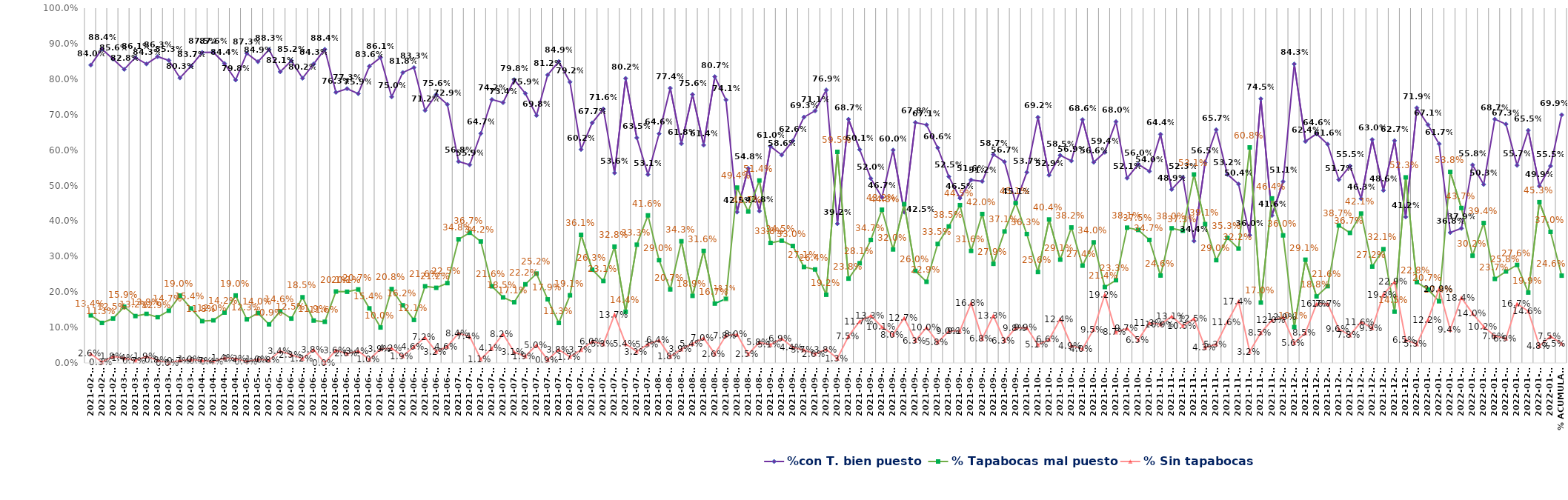
| Category | %con T. bien puesto | % Tapabocas mal puesto | % Sin tapabocas |
|---|---|---|---|
| 2021-02-19 | 0.84 | 0.134 | 0.026 |
| 2021-02-23 | 0.884 | 0.113 | 0.003 |
| 2021-02-25 | 0.856 | 0.125 | 0.018 |
| 2021-03-04 | 0.828 | 0.159 | 0.014 |
| 2021-03-05 | 0.861 | 0.132 | 0.007 |
| 2021-03-10 | 0.843 | 0.138 | 0.019 |
| 2021-03-11 | 0.863 | 0.129 | 0.008 |
| 2021-03-12 | 0.853 | 0.147 | 0 |
| 2021-03-29 | 0.803 | 0.19 | 0.007 |
| 2021-03-30 | 0.837 | 0.154 | 0.01 |
| 2021-04-06 | 0.875 | 0.118 | 0.007 |
| 2021-04-07 | 0.876 | 0.12 | 0.004 |
| 2021-04-15 | 0.844 | 0.142 | 0.014 |
| 2021-04-20 | 0.798 | 0.19 | 0.012 |
| 2021-05-04 | 0.873 | 0.123 | 0.004 |
| 2021-05-07 | 0.849 | 0.14 | 0.01 |
| 2021-05-21 | 0.883 | 0.109 | 0.008 |
| 2021-06-01 | 0.821 | 0.146 | 0.034 |
| 2021-06-04 | 0.852 | 0.125 | 0.023 |
| 2021-06-08 | 0.802 | 0.185 | 0.012 |
| 2021-06-10 | 0.843 | 0.119 | 0.038 |
| 2021-06-11 | 0.884 | 0.116 | 0 |
| 2021-06-12 | 0.763 | 0.201 | 0.036 |
| 2021-06-15 | 0.773 | 0.201 | 0.026 |
| 2021-06-16 | 0.759 | 0.207 | 0.034 |
| 2021-06-18 | 0.836 | 0.154 | 0.01 |
| 2021-06-19 | 0.861 | 0.1 | 0.039 |
| 2021-06-21 | 0.75 | 0.208 | 0.042 |
| 2021-06-22 | 0.818 | 0.162 | 0.019 |
| 2021-06-23 | 0.833 | 0.121 | 0.046 |
| 2021-06-25 | 0.712 | 0.216 | 0.072 |
| 2021-06-26 | 0.756 | 0.212 | 0.032 |
| 2021-06-30 | 0.729 | 0.225 | 0.046 |
| 2021-07-03 | 0.568 | 0.348 | 0.084 |
| 2021-07-06 | 0.559 | 0.367 | 0.074 |
| 2021-07-07 | 0.647 | 0.342 | 0.011 |
| 2021-07-08 | 0.742 | 0.216 | 0.041 |
| 2021-07-09 | 0.734 | 0.185 | 0.082 |
| 2021-07-10 | 0.798 | 0.171 | 0.031 |
| 2021-07-12 | 0.759 | 0.222 | 0.019 |
| 2021-07-13 | 0.698 | 0.252 | 0.05 |
| 2021-07-14 | 0.812 | 0.179 | 0.009 |
| 2021-07-15 | 0.849 | 0.113 | 0.038 |
| 2021-07-16 | 0.792 | 0.191 | 0.017 |
| 2021-07-24 | 0.602 | 0.361 | 0.037 |
| 2021-07-19 | 0.677 | 0.263 | 0.06 |
| 2021-07-21 | 0.716 | 0.231 | 0.053 |
| 2021-07-28 | 0.536 | 0.328 | 0.137 |
| 2021-07-29 | 0.802 | 0.144 | 0.054 |
| 2021-07-30 | 0.635 | 0.333 | 0.032 |
| 2021-07-31 | 0.531 | 0.416 | 0.053 |
| 2021-08-03 | 0.646 | 0.29 | 0.064 |
| 2021-08-04 | 0.774 | 0.207 | 0.018 |
| 2021-08-05 | 0.618 | 0.343 | 0.039 |
| 2021-08-06 | 0.756 | 0.189 | 0.054 |
| 2021-08-17 | 0.614 | 0.316 | 0.07 |
| 2021-08-18 | 0.807 | 0.167 | 0.026 |
| 2021-08-19 | 0.741 | 0.181 | 0.078 |
| 2021-08-20 | 0.425 | 0.494 | 0.08 |
| 2021-08-30 | 0.548 | 0.427 | 0.025 |
| 2021-08-31 | 0.428 | 0.514 | 0.058 |
| 2021-09-01 | 0.61 | 0.338 | 0.051 |
| 2021-09-02 | 0.586 | 0.345 | 0.069 |
| 2021-09-03 | 0.626 | 0.33 | 0.044 |
| 2021-09-04 | 0.693 | 0.271 | 0.037 |
| 2021-09-06 | 0.711 | 0.264 | 0.026 |
| 2021-09-08 | 0.769 | 0.192 | 0.038 |
| 2021-09-10 | 0.392 | 0.595 | 0.013 |
| 2021-09-13 | 0.687 | 0.238 | 0.075 |
| 2021-09-14 | 0.601 | 0.281 | 0.117 |
| 2021-09-15 | 0.52 | 0.347 | 0.133 |
| 2021-09-16 | 0.467 | 0.432 | 0.101 |
| 2021-09-17 | 0.6 | 0.32 | 0.08 |
| 2021-09-18 | 0.425 | 0.448 | 0.127 |
| 2021-09-20 | 0.678 | 0.26 | 0.063 |
| 2021-09-21 | 0.671 | 0.229 | 0.1 |
| 2021-09-22 | 0.606 | 0.335 | 0.058 |
| 2021-09-23 | 0.525 | 0.385 | 0.09 |
| 2021-09-24 | 0.465 | 0.445 | 0.091 |
| 2021-09-25 | 0.516 | 0.316 | 0.168 |
| 2021-09-27 | 0.512 | 0.42 | 0.068 |
| 2021-09-28 | 0.587 | 0.279 | 0.133 |
| 2021-09-29 | 0.567 | 0.371 | 0.062 |
| 2021-09-30 | 0.451 | 0.451 | 0.098 |
| 2021-10-01 | 0.537 | 0.363 | 0.099 |
| 2021-10-05 | 0.692 | 0.256 | 0.051 |
| 2021-10-11 | 0.529 | 0.404 | 0.066 |
| 2021-10-13 | 0.585 | 0.291 | 0.124 |
| 2021-10-14 | 0.569 | 0.382 | 0.049 |
| 2021-10-15 | 0.686 | 0.274 | 0.04 |
| 2021-10-16 | 0.566 | 0.34 | 0.095 |
| 2021-10-19 | 0.594 | 0.214 | 0.192 |
| 2021-10-20 | 0.68 | 0.233 | 0.087 |
| 2021-10-22 | 0.521 | 0.381 | 0.097 |
| 2021-10-26 | 0.56 | 0.375 | 0.065 |
| 2021-10-27 | 0.54 | 0.347 | 0.113 |
| 2021-11-02 | 0.644 | 0.246 | 0.109 |
| 2021-11-03 | 0.489 | 0.38 | 0.131 |
| 2021-11-06 | 0.523 | 0.373 | 0.105 |
| 2021-11-09 | 0.344 | 0.531 | 0.125 |
| 2021-11-10 | 0.565 | 0.391 | 0.043 |
| 2021-11-17 | 0.657 | 0.29 | 0.053 |
| 2021-11-22 | 0.532 | 0.353 | 0.116 |
| 2021-11-24 | 0.504 | 0.322 | 0.174 |
| 2021-11-25 | 0.36 | 0.608 | 0.032 |
| 2021-11-26 | 0.745 | 0.17 | 0.085 |
| 2021-11-29 | 0.416 | 0.464 | 0.12 |
| 2021-12-04 | 0.511 | 0.36 | 0.129 |
| 2021-12-07 | 0.843 | 0.101 | 0.056 |
| 2021-12-09 | 0.624 | 0.291 | 0.085 |
| 2021-12-10 | 0.646 | 0.188 | 0.167 |
| 2021-12-11 | 0.616 | 0.216 | 0.167 |
| 2021-12-13 | 0.517 | 0.387 | 0.096 |
| 2021-12-15 | 0.555 | 0.367 | 0.078 |
| 2021-12-23 | 0.463 | 0.421 | 0.116 |
| 2021-12-24 | 0.63 | 0.272 | 0.099 |
| 2021-12-27 | 0.486 | 0.321 | 0.193 |
| 2021-12-29 | 0.627 | 0.145 | 0.229 |
| 2021-12-31 | 0.412 | 0.523 | 0.065 |
| 2022-01-03 | 0.719 | 0.228 | 0.053 |
| 2022-01-04 | 0.671 | 0.207 | 0.122 |
| 2022-01-06 | 0.617 | 0.174 | 0.209 |
| 2022-01-07 | 0.368 | 0.538 | 0.094 |
| 2022-01-08 | 0.379 | 0.437 | 0.184 |
| 2022-01-11 | 0.558 | 0.302 | 0.14 |
| 2022-01-12 | 0.503 | 0.394 | 0.102 |
| 2022-01-17 | 0.687 | 0.237 | 0.076 |
| 2022-01-18 | 0.673 | 0.258 | 0.069 |
| 2022-01-19 | 0.557 | 0.276 | 0.167 |
| 2022-01-22 | 0.655 | 0.199 | 0.146 |
| 2022-01-24 | 0.499 | 0.453 | 0.048 |
| 2022-01-29 | 0.555 | 0.37 | 0.075 |
| % Acumulado | 0.699 | 0.246 | 0.055 |